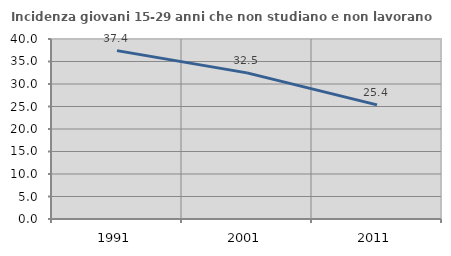
| Category | Incidenza giovani 15-29 anni che non studiano e non lavorano  |
|---|---|
| 1991.0 | 37.421 |
| 2001.0 | 32.473 |
| 2011.0 | 25.361 |